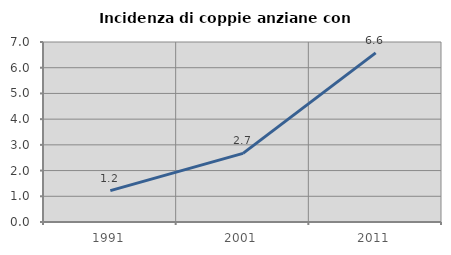
| Category | Incidenza di coppie anziane con figli |
|---|---|
| 1991.0 | 1.22 |
| 2001.0 | 2.667 |
| 2011.0 | 6.579 |